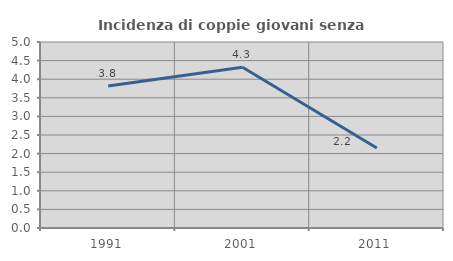
| Category | Incidenza di coppie giovani senza figli |
|---|---|
| 1991.0 | 3.819 |
| 2001.0 | 4.32 |
| 2011.0 | 2.151 |